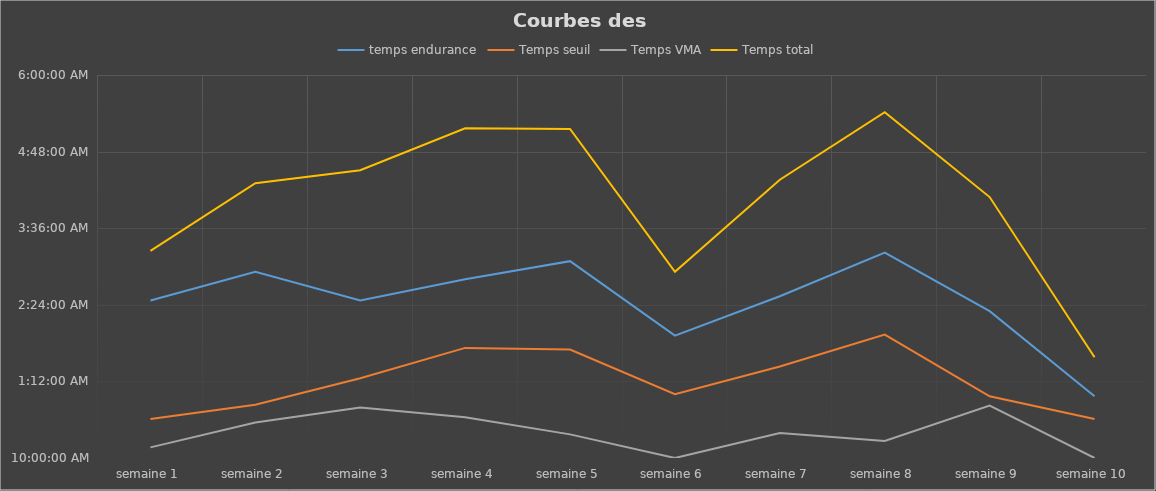
| Category | temps endurance  | Temps seuil | Temps VMA | Temps total |
|---|---|---|---|---|
| semaine 1 | 0.103 | 0.025 | 0.007 | 0.135 |
| semaine 2 | 0.122 | 0.035 | 0.023 | 0.179 |
| semaine 3 | 0.103 | 0.052 | 0.033 | 0.188 |
| semaine 4 | 0.117 | 0.072 | 0.027 | 0.215 |
| semaine 5 | 0.128 | 0.071 | 0.015 | 0.215 |
| semaine 6 | 0.08 | 0.042 | 0 | 0.122 |
| semaine 7 | 0.106 | 0.06 | 0.016 | 0.182 |
| semaine 8 | 0.134 | 0.081 | 0.011 | 0.226 |
| semaine 9 | 0.096 | 0.04 | 0.034 | 0.17 |
| semaine 10 | 0.04 | 0.025 | 0 | 0.066 |